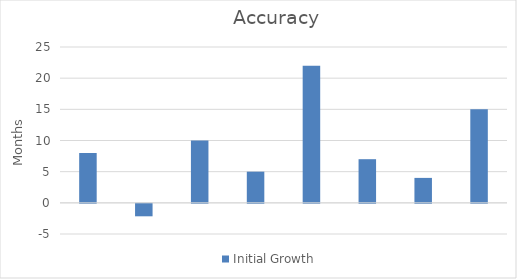
| Category | Initial Growth |
|---|---|
|  | 8 |
|  | -2 |
|  | 10 |
|  | 5 |
|  | 22 |
|  | 7 |
|  | 4 |
|  | 15 |